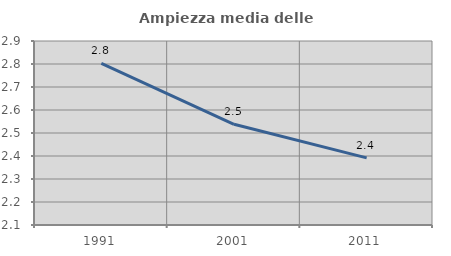
| Category | Ampiezza media delle famiglie |
|---|---|
| 1991.0 | 2.803 |
| 2001.0 | 2.538 |
| 2011.0 | 2.392 |